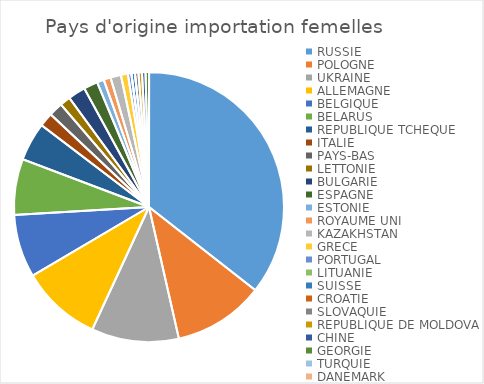
| Category | Series 0 |
|---|---|
| RUSSIE | 85 |
| POLOGNE | 26 |
| UKRAINE | 25 |
| ALLEMAGNE | 23 |
| BELGIQUE | 18 |
| BELARUS | 16 |
| REPUBLIQUE TCHEQUE | 11 |
| ITALIE | 4 |
| PAYS-BAS | 4 |
| LETTONIE | 3 |
| BULGARIE | 5 |
| ESPAGNE | 4 |
| ESTONIE | 2 |
| ROYAUME UNI | 2 |
| KAZAKHSTAN | 3 |
| GRECE | 2 |
| PORTUGAL | 1 |
| LITUANIE | 0 |
| SUISSE | 1 |
| CROATIE | 0 |
| SLOVAQUIE | 1 |
| REPUBLIQUE DE MOLDOVA | 1 |
| CHINE | 1 |
| GEORGIE | 1 |
| TURQUIE | 0 |
| DANEMARK | 0 |